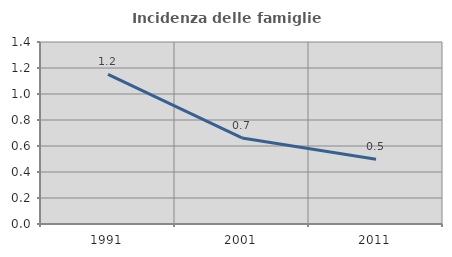
| Category | Incidenza delle famiglie numerose |
|---|---|
| 1991.0 | 1.15 |
| 2001.0 | 0.662 |
| 2011.0 | 0.499 |